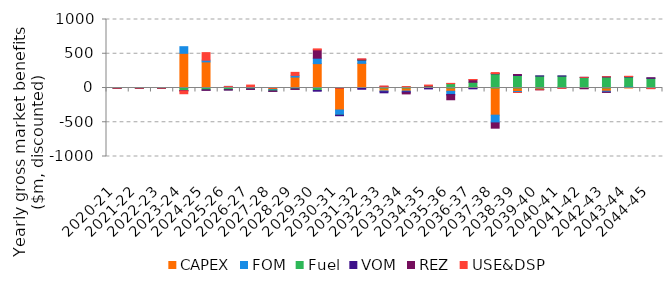
| Category | CAPEX | FOM | Fuel | VOM | REZ | USE&DSP |
|---|---|---|---|---|---|---|
| 2020-21 | -0.022 | -0.005 | -0.001 | 0 | -0.001 | -0.001 |
| 2021-22 | -0.004 | -0.001 | -0.001 | 0 | 0 | -0.001 |
| 2022-23 | -0.011 | -0.001 | -0.001 | 0 | 0 | -0.001 |
| 2023-24 | 506.185 | 96.809 | -36.443 | -5.423 | 0 | -41.809 |
| 2024-25 | 381.303 | 24.357 | -27.649 | -4.012 | 0 | 110.651 |
| 2025-26 | 14.803 | 8.162 | -24.954 | -2.849 | 0 | 0.084 |
| 2026-27 | 15.339 | 4.39 | -15.214 | -3.635 | 0 | 23.176 |
| 2027-28 | -21.563 | -7.229 | -15.626 | -3.504 | 0 | 0.139 |
| 2028-29 | 159.545 | 24.619 | -14.739 | -3.321 | 0 | 44.003 |
| 2029-30 | 355.739 | 79.431 | -35.077 | -11.784 | 121.414 | 14.406 |
| 2030-31 | -321.444 | -75.153 | -0.428 | -7.602 | 0 | 3.731 |
| 2031-32 | 360.093 | 47.422 | 0.499 | -18.474 | 12.101 | 4.663 |
| 2032-33 | -43.43 | -10.473 | 11.626 | -16.259 | 12.181 | 4.502 |
| 2033-34 | -45.467 | -10.279 | 17.407 | -13.978 | -16.437 | 3.137 |
| 2034-35 | 5.229 | 6.709 | 16.356 | -13.35 | 4.194 | 10.445 |
| 2035-36 | -47.914 | -46.353 | 63.165 | -8.296 | -69.071 | 4.28 |
| 2036-37 | 20.471 | -4.48 | 63.453 | -7.729 | 36.488 | 3.865 |
| 2037-38 | -396.74 | -112.768 | 206.817 | 4.255 | -76.997 | 14.03 |
| 2038-39 | -52.052 | -14.05 | 183.124 | 6.343 | 7.431 | -0.043 |
| 2039-40 | -19.507 | -3.093 | 173.991 | 2.399 | -3.057 | -0.262 |
| 2040-41 | 11.937 | 1.779 | 159.419 | 3.119 | 0 | -2.386 |
| 2041-42 | -4.246 | 3.624 | 149.187 | 2.818 | -7.014 | 0.216 |
| 2042-43 | -46.858 | -13.142 | 160.213 | 3.967 | -4.275 | 0.037 |
| 2043-44 | 21.213 | 4.804 | 136.082 | 4.7 | 1.051 | 3.298 |
| 2044-45 | -6.856 | -0.908 | 141.529 | 5.357 | 0.089 | -2.152 |